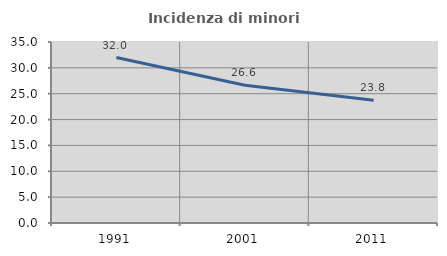
| Category | Incidenza di minori stranieri |
|---|---|
| 1991.0 | 32 |
| 2001.0 | 26.642 |
| 2011.0 | 23.75 |